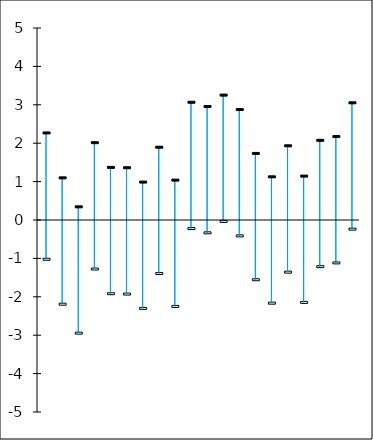
| Category | Series 1 | Series 2 |
|---|---|---|
| 0 | -1.022 | 2.267 |
| 1 | -2.192 | 1.097 |
| 2 | -2.947 | 0.343 |
| 3 | -1.276 | 2.014 |
| 4 | -1.92 | 1.37 |
| 5 | -1.929 | 1.361 |
| 6 | -2.302 | 0.988 |
| 7 | -1.394 | 1.895 |
| 8 | -2.251 | 1.039 |
| 9 | -0.223 | 3.066 |
| 10 | -0.334 | 2.955 |
| 11 | -0.037 | 3.252 |
| 12 | -0.413 | 2.876 |
| 13 | -1.556 | 1.734 |
| 14 | -2.166 | 1.124 |
| 15 | -1.357 | 1.932 |
| 16 | -2.146 | 1.143 |
| 17 | -1.214 | 2.075 |
| 18 | -1.117 | 2.173 |
| 19 | -0.238 | 3.051 |